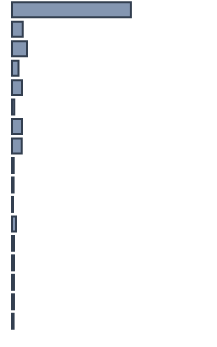
| Category | Series 0 |
|---|---|
| 0 | 59.154 |
| 1 | 5.353 |
| 2 | 7.442 |
| 3 | 3.246 |
| 4 | 4.988 |
| 5 | 1.162 |
| 6 | 4.939 |
| 7 | 4.843 |
| 8 | 0.853 |
| 9 | 0.793 |
| 10 | 0.511 |
| 11 | 1.938 |
| 12 | 1.045 |
| 13 | 0.982 |
| 14 | 0.98 |
| 15 | 0.98 |
| 16 | 0.793 |